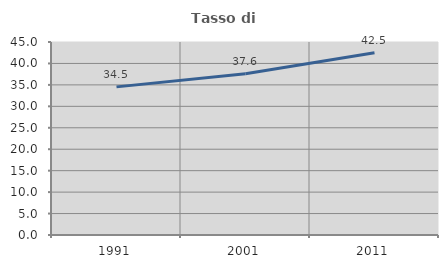
| Category | Tasso di occupazione   |
|---|---|
| 1991.0 | 34.539 |
| 2001.0 | 37.616 |
| 2011.0 | 42.482 |